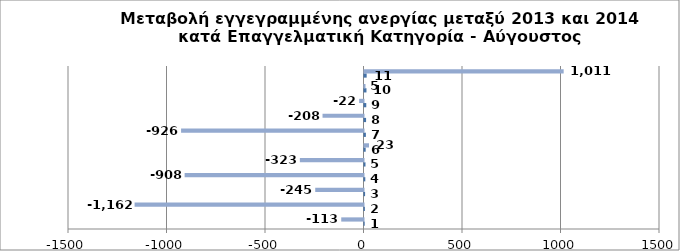
| Category | Series 0 | Series 1 |
|---|---|---|
| 0 | 1 | -113 |
| 1 | 2 | -1162 |
| 2 | 3 | -245 |
| 3 | 4 | -908 |
| 4 | 5 | -323 |
| 5 | 6 | 23 |
| 6 | 7 | -926 |
| 7 | 8 | -208 |
| 8 | 9 | -22 |
| 9 | 10 | 5 |
| 10 | 11 | 1011 |